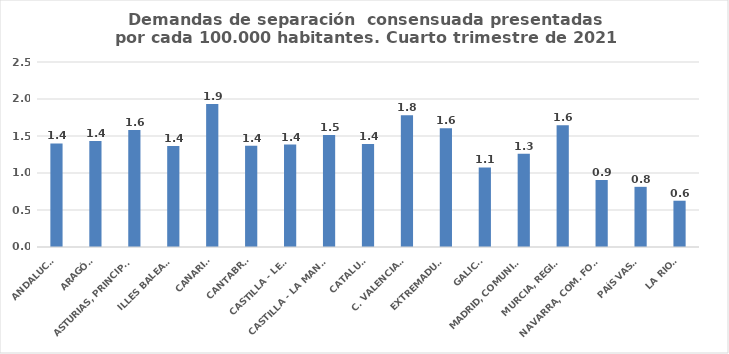
| Category | Series 0 |
|---|---|
| ANDALUCÍA | 1.4 |
| ARAGÓN | 1.433 |
| ASTURIAS, PRINCIPADO | 1.581 |
| ILLES BALEARS | 1.364 |
| CANARIAS | 1.933 |
| CANTABRIA | 1.369 |
| CASTILLA - LEÓN | 1.385 |
| CASTILLA - LA MANCHA | 1.513 |
| CATALUÑA | 1.391 |
| C. VALENCIANA | 1.779 |
| EXTREMADURA | 1.605 |
| GALICIA | 1.076 |
| MADRID, COMUNIDAD | 1.259 |
| MURCIA, REGIÓN | 1.646 |
| NAVARRA, COM. FORAL | 0.907 |
| PAÍS VASCO | 0.813 |
| LA RIOJA | 0.625 |